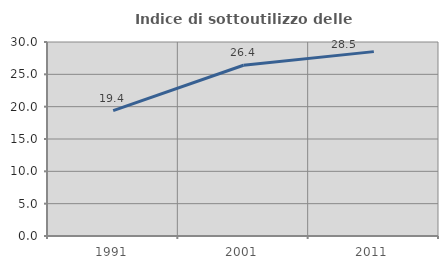
| Category | Indice di sottoutilizzo delle abitazioni  |
|---|---|
| 1991.0 | 19.396 |
| 2001.0 | 26.4 |
| 2011.0 | 28.51 |